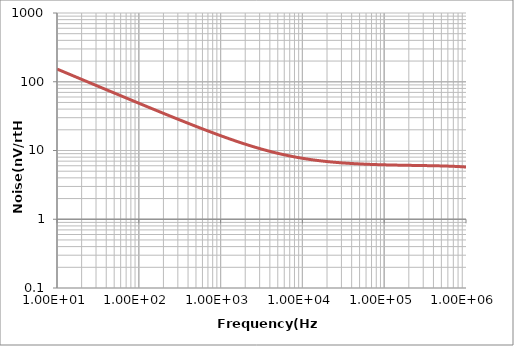
| Category | Low Pass Filter |
|---|---|
| 10.0 | 153.088 |
| 10.373 | 150.315 |
| 10.932 | 146.428 |
| 11.304 | 144.002 |
| 11.863 | 140.575 |
| 12.422 | 137.381 |
| 13.168 | 133.44 |
| 13.727 | 130.701 |
| 14.286 | 128.124 |
| 15.031 | 124.915 |
| 15.776 | 121.937 |
| 16.522 | 119.159 |
| 17.267 | 116.567 |
| 18.012 | 114.137 |
| 18.944 | 111.302 |
| 19.876 | 108.669 |
| 20.807 | 106.218 |
| 21.739 | 103.923 |
| 22.857 | 101.359 |
| 23.975 | 98.976 |
| 25.093 | 96.754 |
| 26.211 | 94.676 |
| 27.516 | 92.413 |
| 28.82 | 90.307 |
| 30.124 | 88.34 |
| 31.615 | 86.241 |
| 33.106 | 84.286 |
| 34.596 | 82.461 |
| 36.273 | 80.542 |
| 37.95 | 78.753 |
| 39.627 | 77.078 |
| 41.677 | 75.171 |
| 43.54 | 73.555 |
| 45.59 | 71.894 |
| 47.826 | 70.205 |
| 50.062 | 68.631 |
| 52.298 | 67.159 |
| 54.907 | 65.557 |
| 57.516 | 64.066 |
| 60.124 | 62.673 |
| 62.919 | 61.279 |
| 65.901 | 59.89 |
| 69.068 | 58.515 |
| 72.422 | 57.158 |
| 75.776 | 55.893 |
| 79.317 | 54.646 |
| 83.043 | 53.421 |
| 86.957 | 52.221 |
| 91.056 | 51.047 |
| 95.342 | 49.903 |
| 100.0 | 48.744 |
| 104.478 | 47.704 |
| 108.955 | 46.73 |
| 113.433 | 45.814 |
| 119.403 | 44.674 |
| 125.373 | 43.617 |
| 131.343 | 42.633 |
| 137.313 | 41.715 |
| 143.284 | 40.855 |
| 150.746 | 39.853 |
| 158.209 | 38.924 |
| 165.672 | 38.058 |
| 173.134 | 37.25 |
| 180.597 | 36.493 |
| 189.552 | 35.644 |
| 198.507 | 34.854 |
| 207.463 | 34.116 |
| 217.91 | 33.314 |
| 228.358 | 32.568 |
| 238.806 | 31.873 |
| 250.746 | 31.132 |
| 262.687 | 30.443 |
| 274.627 | 29.8 |
| 288.06 | 29.126 |
| 301.493 | 28.498 |
| 314.925 | 27.911 |
| 329.851 | 27.302 |
| 346.269 | 26.679 |
| 362.687 | 26.1 |
| 379.104 | 25.559 |
| 397.015 | 25.008 |
| 416.418 | 24.453 |
| 435.821 | 23.936 |
| 456.716 | 23.417 |
| 477.612 | 22.933 |
| 500.0 | 22.45 |
| 523.881 | 21.97 |
| 549.254 | 21.495 |
| 574.627 | 21.053 |
| 601.493 | 20.616 |
| 629.851 | 20.187 |
| 659.701 | 19.766 |
| 691.045 | 19.355 |
| 723.881 | 18.954 |
| 758.209 | 18.564 |
| 794.03 | 18.185 |
| 831.343 | 17.818 |
| 870.149 | 17.462 |
| 911.94 | 17.105 |
| 953.731 | 16.774 |
| 1000.0 | 16.432 |
| 1023.87 | 16.265 |
| 1095.49 | 15.799 |
| 1143.24 | 15.514 |
| 1190.98 | 15.247 |
| 1238.73 | 14.997 |
| 1310.35 | 14.648 |
| 1358.09 | 14.433 |
| 1429.71 | 14.13 |
| 1501.33 | 13.851 |
| 1572.94 | 13.593 |
| 1644.56 | 13.352 |
| 1716.18 | 13.128 |
| 1811.67 | 12.852 |
| 1883.29 | 12.659 |
| 1978.78 | 12.42 |
| 2074.27 | 12.199 |
| 2169.76 | 11.994 |
| 2289.12 | 11.757 |
| 2384.61 | 11.581 |
| 2503.98 | 11.378 |
| 2623.34 | 11.189 |
| 2742.71 | 11.014 |
| 2862.07 | 10.852 |
| 3005.3 | 10.671 |
| 3148.54 | 10.503 |
| 3291.78 | 10.348 |
| 3458.89 | 10.181 |
| 3625.99 | 10.027 |
| 3793.1 | 9.884 |
| 3960.21 | 9.751 |
| 4151.19 | 9.611 |
| 4342.18 | 9.481 |
| 4557.03 | 9.346 |
| 4771.88 | 9.222 |
| 5010.61 | 9.094 |
| 5225.46 | 8.988 |
| 5488.06 | 8.868 |
| 5750.66 | 8.757 |
| 6013.26 | 8.655 |
| 6299.73 | 8.552 |
| 6586.21 | 8.457 |
| 6896.55 | 8.362 |
| 7230.77 | 8.268 |
| 7564.99 | 8.181 |
| 7923.08 | 8.095 |
| 8305.04 | 8.011 |
| 8687.0 | 7.933 |
| 9116.71 | 7.853 |
| 9546.42 | 7.779 |
| 10000.0 | 7.707 |
| 10382.2 | 7.651 |
| 10955.4 | 7.574 |
| 11337.6 | 7.526 |
| 11910.8 | 7.46 |
| 12484.1 | 7.399 |
| 13057.3 | 7.343 |
| 13630.6 | 7.292 |
| 14394.9 | 7.229 |
| 14968.2 | 7.186 |
| 15732.5 | 7.132 |
| 16496.8 | 7.084 |
| 17261.1 | 7.04 |
| 18025.5 | 6.999 |
| 18980.9 | 6.952 |
| 19936.3 | 6.909 |
| 20891.7 | 6.87 |
| 21847.1 | 6.834 |
| 22802.5 | 6.801 |
| 23949.0 | 6.765 |
| 25095.5 | 6.732 |
| 26242.0 | 6.702 |
| 27388.5 | 6.674 |
| 28726.1 | 6.644 |
| 30063.7 | 6.617 |
| 31592.4 | 6.588 |
| 32929.9 | 6.565 |
| 34649.7 | 6.538 |
| 36178.3 | 6.516 |
| 37898.1 | 6.494 |
| 39808.9 | 6.471 |
| 41528.7 | 6.452 |
| 43630.6 | 6.431 |
| 45541.4 | 6.413 |
| 47834.4 | 6.394 |
| 49936.3 | 6.378 |
| 52420.4 | 6.36 |
| 54904.5 | 6.344 |
| 57388.5 | 6.33 |
| 60254.8 | 6.314 |
| 62929.9 | 6.301 |
| 65987.3 | 6.287 |
| 69044.6 | 6.275 |
| 72293.0 | 6.262 |
| 75732.5 | 6.25 |
| 79363.1 | 6.239 |
| 82993.6 | 6.228 |
| 87006.4 | 6.218 |
| 91019.1 | 6.208 |
| 95414.0 | 6.198 |
| 100000.0 | 6.189 |
| 104584.0 | 6.18 |
| 109168.0 | 6.172 |
| 113752.0 | 6.165 |
| 119864.0 | 6.156 |
| 124448.0 | 6.15 |
| 130560.0 | 6.142 |
| 136672.0 | 6.135 |
| 144312.0 | 6.127 |
| 150424.0 | 6.122 |
| 158065.0 | 6.115 |
| 165705.0 | 6.108 |
| 173345.0 | 6.103 |
| 180985.0 | 6.097 |
| 190153.0 | 6.091 |
| 199321.0 | 6.085 |
| 208489.0 | 6.08 |
| 217657.0 | 6.075 |
| 228353.0 | 6.069 |
| 239049.0 | 6.064 |
| 249745.0 | 6.059 |
| 261969.0 | 6.054 |
| 274194.0 | 6.049 |
| 287946.0 | 6.043 |
| 301698.0 | 6.038 |
| 315450.0 | 6.032 |
| 330730.0 | 6.027 |
| 346010.0 | 6.021 |
| 362818.0 | 6.015 |
| 379626.0 | 6.009 |
| 397963.0 | 6.003 |
| 416299.0 | 5.996 |
| 436163.0 | 5.989 |
| 456027.0 | 5.982 |
| 477419.0 | 5.975 |
| 500340.0 | 5.966 |
| 524788.0 | 5.957 |
| 549236.0 | 5.948 |
| 575212.0 | 5.939 |
| 601188.0 | 5.929 |
| 630221.0 | 5.917 |
| 659253.0 | 5.905 |
| 691341.0 | 5.892 |
| 723430.0 | 5.879 |
| 758574.0 | 5.863 |
| 793718.0 | 5.847 |
| 830390.0 | 5.83 |
| 870119.0 | 5.811 |
| 911375.0 | 5.791 |
| 954160.0 | 5.769 |
| 1000000.0 | 5.745 |
| 1047130.0 | 5.72 |
| 1096480.0 | 5.693 |
| 1148150.0 | 5.663 |
| 1202260.0 | 5.632 |
| 1258930.0 | 5.598 |
| 1318260.0 | 5.561 |
| 1380380.0 | 5.522 |
| 1445440.0 | 5.48 |
| 1513560.0 | 5.436 |
| 1584890.0 | 5.388 |
| 1659590.0 | 5.337 |
| 1737800.0 | 5.283 |
| 1819700.0 | 5.225 |
| 1905460.0 | 5.164 |
| 1995260.0 | 5.1 |
| 2089300.0 | 5.032 |
| 2187760.0 | 4.96 |
| 2290870.0 | 4.886 |
| 2398830.0 | 4.807 |
| 2511890.0 | 4.726 |
| 2630270.0 | 4.641 |
| 2754230.0 | 4.553 |
| 2884030.0 | 4.462 |
| 3019950.0 | 4.368 |
| 3162280.0 | 4.272 |
| 3311310.0 | 4.174 |
| 3467370.0 | 4.073 |
| 3630780.0 | 3.971 |
| 3801890.0 | 3.867 |
| 3981070.0 | 3.762 |
| 4168690.0 | 3.656 |
| 4365160.0 | 3.55 |
| 4570880.0 | 3.443 |
| 4786300.0 | 3.337 |
| 5011870.0 | 3.231 |
| 5248070.0 | 3.126 |
| 5495410.0 | 3.021 |
| 5754400.0 | 2.918 |
| 6025600.0 | 2.816 |
| 6309570.0 | 2.715 |
| 6606930.0 | 2.617 |
| 6918310.0 | 2.52 |
| 7244360.0 | 2.425 |
| 7585780.0 | 2.333 |
| 7943280.0 | 2.243 |
| 8317640.0 | 2.155 |
| 8709640.0 | 2.07 |
| 9120110.0 | 1.987 |
| 9549930.0 | 1.907 |
| 10000000.0 | 1.829 |
| 10471300.0 | 1.754 |
| 10964800.0 | 1.681 |
| 11481500.0 | 1.611 |
| 12022600.0 | 1.544 |
| 12589300.0 | 1.478 |
| 13182600.0 | 1.416 |
| 13803800.0 | 1.355 |
| 14454400.0 | 1.297 |
| 15135600.0 | 1.241 |
| 15848900.0 | 1.188 |
| 16595900.0 | 1.136 |
| 17378000.0 | 1.087 |
| 18197000.0 | 1.039 |
| 19054600.0 | 0.994 |
| 19952600.0 | 0.95 |
| 20893000.0 | 0.909 |
| 21877600.0 | 0.868 |
| 22908700.0 | 0.83 |
| 23988300.0 | 0.793 |
| 25118900.0 | 0.758 |
| 26302700.0 | 0.725 |
| 27542300.0 | 0.693 |
| 28840300.0 | 0.662 |
| 30199500.0 | 0.632 |
| 31622800.0 | 0.604 |
| 33113100.0 | 0.577 |
| 34673700.0 | 0.551 |
| 36307800.0 | 0.527 |
| 38018900.0 | 0.503 |
| 39810700.0 | 0.481 |
| 41686900.0 | 0.459 |
| 43651600.0 | 0.439 |
| 45708800.0 | 0.419 |
| 47863000.0 | 0.4 |
| 50118700.0 | 0.382 |
| 52480700.0 | 0.365 |
| 54954100.0 | 0.349 |
| 57544000.0 | 0.333 |
| 60256000.0 | 0.318 |
| 63095700.0 | 0.304 |
| 66069300.0 | 0.29 |
| 69183100.0 | 0.277 |
| 72443600.0 | 0.265 |
| 75857800.0 | 0.253 |
| 79432800.0 | 0.242 |
| 83176400.0 | 0.231 |
| 87096400.0 | 0.22 |
| 91201100.0 | 0.21 |
| 95499300.0 | 0.201 |
| 100000000.0 | 0.192 |